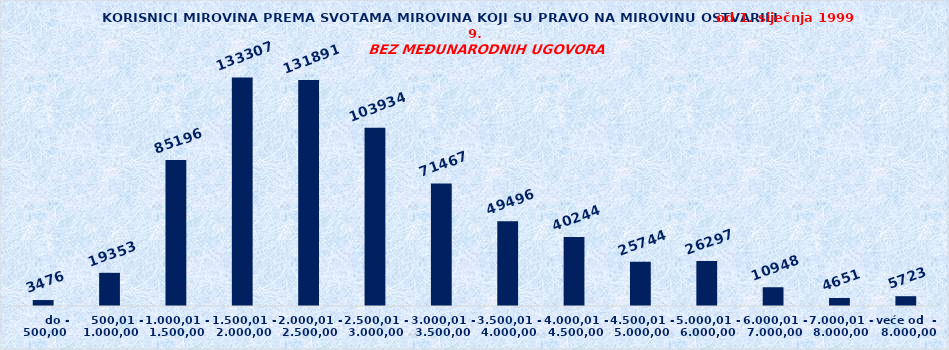
| Category | Series 0 |
|---|---|
|       do - 500,00 | 3476 |
|    500,01 - 1.000,00 | 19353 |
| 1.000,01 - 1.500,00 | 85196 |
| 1.500,01 - 2.000,00 | 133307 |
| 2.000,01 - 2.500,00 | 131891 |
| 2.500,01 - 3.000,00 | 103934 |
| 3.000,01 - 3.500,00 | 71467 |
| 3.500,01 - 4.000,00 | 49496 |
| 4.000,01 - 4.500,00 | 40244 |
| 4.500,01 - 5.000,00 | 25744 |
| 5.000,01 - 6.000,00 | 26297 |
| 6.000,01 - 7.000,00 | 10948 |
| 7.000,01 - 8.000,00 | 4651 |
| veće od  -  8.000,00 | 5723 |